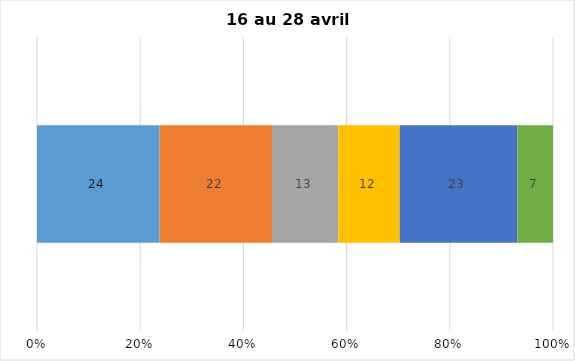
| Category | Plusieurs fois par jour | Une fois par jour | Quelques fois par semaine   | Une fois par semaine ou moins   |  Jamais   |  Je n’utilise pas les médias sociaux |
|---|---|---|---|---|---|---|
| 0 | 24 | 22 | 13 | 12 | 23 | 7 |